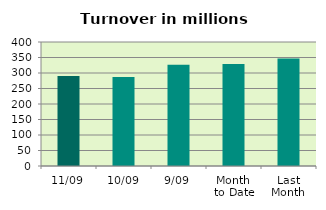
| Category | Series 0 |
|---|---|
| 11/09 | 290.215 |
| 10/09 | 287.28 |
| 9/09 | 326.679 |
| Month 
to Date | 328.747 |
| Last
Month | 347.074 |